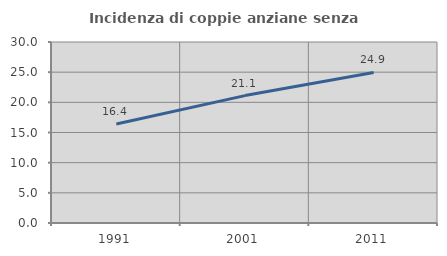
| Category | Incidenza di coppie anziane senza figli  |
|---|---|
| 1991.0 | 16.41 |
| 2001.0 | 21.116 |
| 2011.0 | 24.95 |